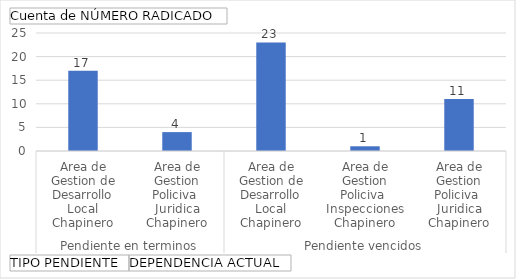
| Category | Total |
|---|---|
| 0 | 17 |
| 1 | 4 |
| 2 | 23 |
| 3 | 1 |
| 4 | 11 |